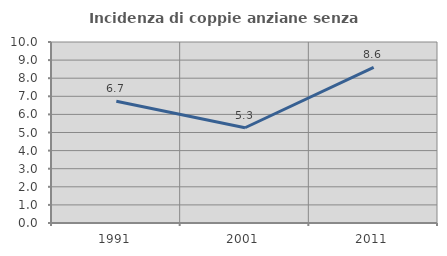
| Category | Incidenza di coppie anziane senza figli  |
|---|---|
| 1991.0 | 6.728 |
| 2001.0 | 5.263 |
| 2011.0 | 8.602 |